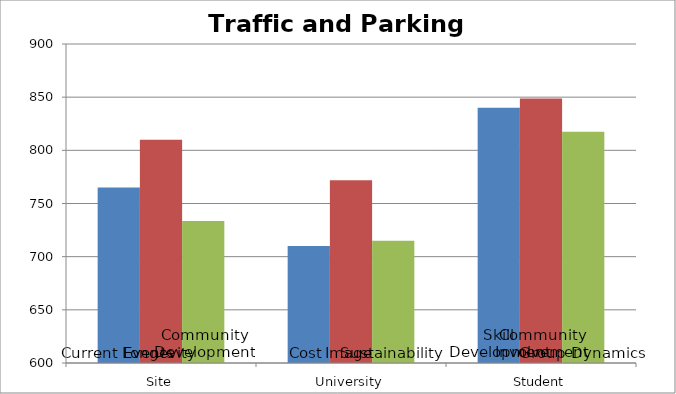
| Category | Alignment1 | Alignment2 | Alignment3 |
|---|---|---|---|
| 0 | 765 | 810 | 733.5 |
| 1 | 710 | 771.75 | 715 |
| 2 | 840 | 848.75 | 817.5 |